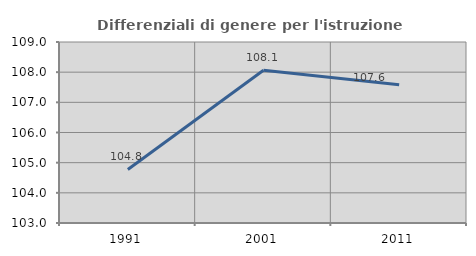
| Category | Differenziali di genere per l'istruzione superiore |
|---|---|
| 1991.0 | 104.774 |
| 2001.0 | 108.062 |
| 2011.0 | 107.586 |